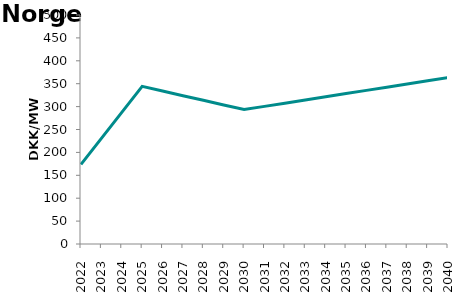
| Category | Series 2 |
|---|---|
| 2022.0 | 173.728 |
| 2023.0 | 230.536 |
| 2024.0 | 287.447 |
| 2025.0 | 344.146 |
| 2026.0 | 334.017 |
| 2027.0 | 323.88 |
| 2028.0 | 313.865 |
| 2029.0 | 303.636 |
| 2030.0 | 293.504 |
| 2031.0 | 300.467 |
| 2032.0 | 307.479 |
| 2033.0 | 314.43 |
| 2034.0 | 321.392 |
| 2035.0 | 328.388 |
| 2036.0 | 335.465 |
| 2037.0 | 342.254 |
| 2038.0 | 349.121 |
| 2039.0 | 356.281 |
| 2040.0 | 363.352 |